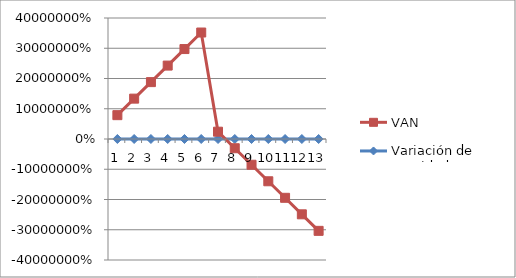
| Category | Variación de Cantidad | VAN |
|---|---|---|
| 0 | 0.05 | 78793.009 |
| 1 | 0.1 | 133427.591 |
| 2 | 0.15 | 188062.172 |
| 3 | 0.2 | 242696.754 |
| 4 | 0.25 | 297331.336 |
| 5 | 0.3 | 351965.917 |
| 6 | 0 | 24158.428 |
| 7 | -0.05 | -30476.154 |
| 8 | -0.1 | -85110.736 |
| 9 | -0.15 | -139745.317 |
| 10 | -0.2 | -194379.899 |
| 11 | -0.25 | -249014.48 |
| 12 | -0.3 | -303649.062 |